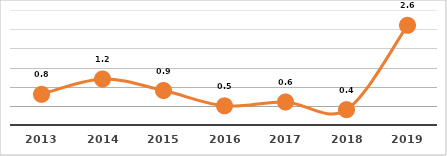
| Category | COBERTURA DE BECADOS EXTERNOS (%) |
|---|---|
| 2013.0 | 0.8 |
| 2014.0 | 1.2 |
| 2015.0 | 0.9 |
| 2016.0 | 0.5 |
| 2017.0 | 0.6 |
| 2018.0 | 0.4 |
| 2019.0 | 2.6 |